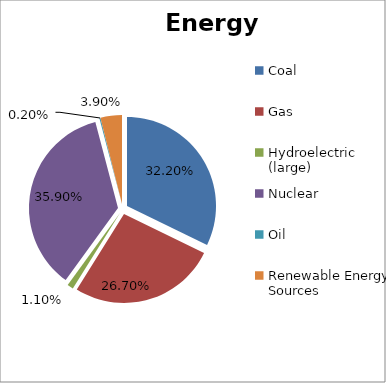
| Category | Energy Source |
|---|---|
| Coal | 0.322 |
| Gas | 0.267 |
| Hydroelectric (large) | 0.011 |
| Nuclear | 0.359 |
| Oil | 0.002 |
| Renewable Energy Sources | 0.039 |